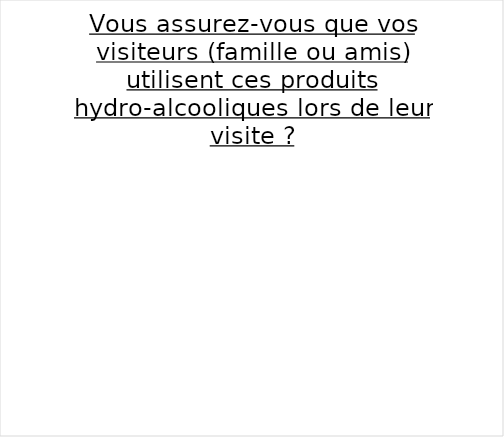
| Category | Series 0 |
|---|---|
| Toujours | 0 |
| Parfois | 0 |
| Jamais | 0 |